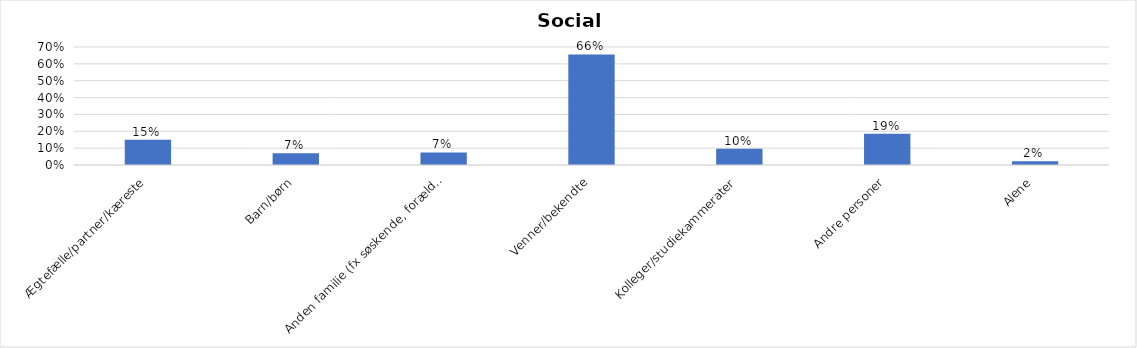
| Category | % |
|---|---|
| Ægtefælle/partner/kæreste | 0.15 |
| Barn/børn | 0.07 |
| Anden familie (fx søskende, forældre) | 0.075 |
| Venner/bekendte | 0.656 |
| Kolleger/studiekammerater | 0.096 |
| Andre personer | 0.185 |
| Alene | 0.023 |